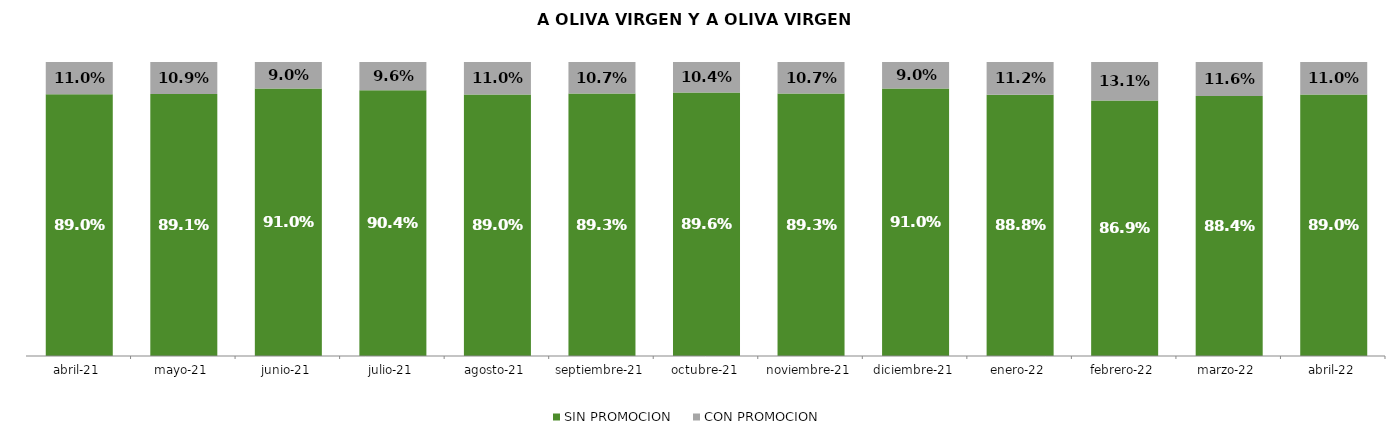
| Category | SIN PROMOCION   | CON PROMOCION   |
|---|---|---|
| 2021-04-01 | 0.89 | 0.11 |
| 2021-05-01 | 0.891 | 0.109 |
| 2021-06-01 | 0.91 | 0.09 |
| 2021-07-01 | 0.904 | 0.096 |
| 2021-08-01 | 0.89 | 0.11 |
| 2021-09-01 | 0.893 | 0.107 |
| 2021-10-01 | 0.896 | 0.104 |
| 2021-11-01 | 0.893 | 0.107 |
| 2021-12-01 | 0.91 | 0.09 |
| 2022-01-01 | 0.888 | 0.112 |
| 2022-02-01 | 0.869 | 0.131 |
| 2022-03-01 | 0.884 | 0.116 |
| 2022-04-01 | 0.89 | 0.11 |